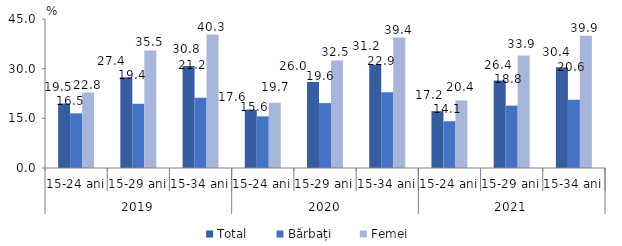
| Category | Total | Bărbați | Femei |
|---|---|---|---|
| 0 | 19.5 | 16.5 | 22.8 |
| 1 | 27.4 | 19.4 | 35.5 |
| 2 | 30.8 | 21.2 | 40.3 |
| 3 | 17.6 | 15.6 | 19.7 |
| 4 | 26 | 19.6 | 32.5 |
| 5 | 31.2 | 22.9 | 39.4 |
| 6 | 17.182 | 14.118 | 20.4 |
| 7 | 26.411 | 18.841 | 33.947 |
| 8 | 30.439 | 20.602 | 39.92 |